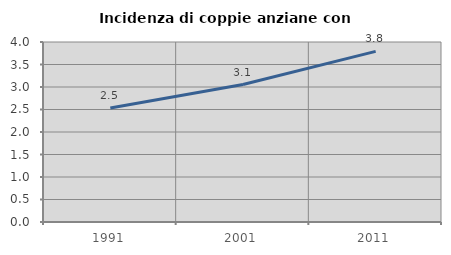
| Category | Incidenza di coppie anziane con figli |
|---|---|
| 1991.0 | 2.533 |
| 2001.0 | 3.056 |
| 2011.0 | 3.791 |